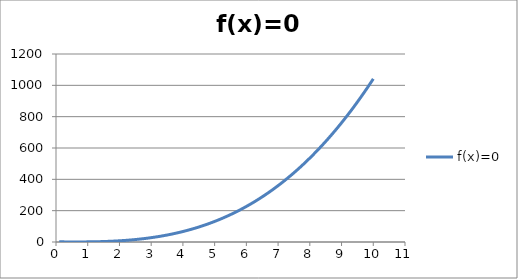
| Category | f(x)=0 |
|---|---|
| 0.1 | 1.057 |
| 0.2 | 0.882 |
| 0.30000000000000004 | 0.731 |
| 0.4 | 0.61 |
| 0.5 | 0.525 |
| 0.6 | 0.482 |
| 0.7 | 0.487 |
| 0.7999999999999999 | 0.546 |
| 0.8999999999999999 | 0.665 |
| 0.9999999999999999 | 0.85 |
| 1.0999999999999999 | 1.107 |
| 1.2 | 1.442 |
| 1.3 | 1.861 |
| 1.4000000000000001 | 2.37 |
| 1.5000000000000002 | 2.975 |
| 1.6000000000000003 | 3.682 |
| 1.7000000000000004 | 4.497 |
| 1.8000000000000005 | 5.426 |
| 1.9000000000000006 | 6.475 |
| 2.0000000000000004 | 7.65 |
| 2.1000000000000005 | 8.957 |
| 2.2000000000000006 | 10.402 |
| 2.3000000000000007 | 11.991 |
| 2.400000000000001 | 13.73 |
| 2.500000000000001 | 15.625 |
| 2.600000000000001 | 17.682 |
| 2.700000000000001 | 19.907 |
| 2.800000000000001 | 22.306 |
| 2.9000000000000012 | 24.885 |
| 3.0000000000000013 | 27.65 |
| 3.1000000000000014 | 30.607 |
| 3.2000000000000015 | 33.762 |
| 3.3000000000000016 | 37.121 |
| 3.4000000000000017 | 40.69 |
| 3.5000000000000018 | 44.475 |
| 3.600000000000002 | 48.482 |
| 3.700000000000002 | 52.717 |
| 3.800000000000002 | 57.186 |
| 3.900000000000002 | 61.895 |
| 4.000000000000002 | 66.85 |
| 4.100000000000001 | 72.057 |
| 4.200000000000001 | 77.522 |
| 4.300000000000001 | 83.251 |
| 4.4 | 89.25 |
| 4.5 | 95.525 |
| 4.6 | 102.082 |
| 4.699999999999999 | 108.927 |
| 4.799999999999999 | 116.066 |
| 4.899999999999999 | 123.505 |
| 4.999999999999998 | 131.25 |
| 5.099999999999998 | 139.307 |
| 5.1999999999999975 | 147.682 |
| 5.299999999999997 | 156.381 |
| 5.399999999999997 | 165.41 |
| 5.4999999999999964 | 174.775 |
| 5.599999999999996 | 184.482 |
| 5.699999999999996 | 194.537 |
| 5.799999999999995 | 204.946 |
| 5.899999999999995 | 215.715 |
| 5.999999999999995 | 226.85 |
| 6.099999999999994 | 238.357 |
| 6.199999999999994 | 250.242 |
| 6.299999999999994 | 262.511 |
| 6.399999999999993 | 275.17 |
| 6.499999999999993 | 288.225 |
| 6.5999999999999925 | 301.682 |
| 6.699999999999992 | 315.547 |
| 6.799999999999992 | 329.826 |
| 6.8999999999999915 | 344.525 |
| 6.999999999999991 | 359.65 |
| 7.099999999999991 | 375.207 |
| 7.19999999999999 | 391.202 |
| 7.29999999999999 | 407.641 |
| 7.39999999999999 | 424.53 |
| 7.499999999999989 | 441.875 |
| 7.599999999999989 | 459.682 |
| 7.699999999999989 | 477.957 |
| 7.799999999999988 | 496.706 |
| 7.899999999999988 | 515.935 |
| 7.999999999999988 | 535.65 |
| 8.099999999999987 | 555.857 |
| 8.199999999999987 | 576.562 |
| 8.299999999999986 | 597.771 |
| 8.399999999999986 | 619.49 |
| 8.499999999999986 | 641.725 |
| 8.599999999999985 | 664.482 |
| 8.699999999999985 | 687.767 |
| 8.799999999999985 | 711.586 |
| 8.899999999999984 | 735.945 |
| 8.999999999999984 | 760.85 |
| 9.099999999999984 | 786.307 |
| 9.199999999999983 | 812.322 |
| 9.299999999999983 | 838.901 |
| 9.399999999999983 | 866.05 |
| 9.499999999999982 | 893.775 |
| 9.599999999999982 | 922.082 |
| 9.699999999999982 | 950.977 |
| 9.799999999999981 | 980.466 |
| 9.89999999999998 | 1010.555 |
| 9.99999999999998 | 1041.25 |